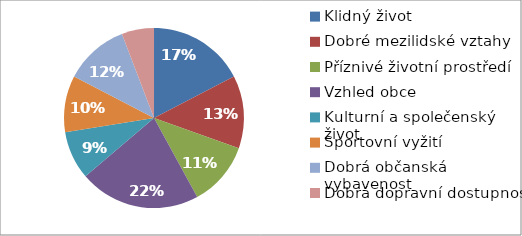
| Category | Series 0 |
|---|---|
| Klidný život | 12 |
| Dobré mezilidské vztahy | 9 |
| Příznivé životní prostředí | 8 |
| Vzhled obce | 15 |
| Kulturní a společenský život | 6 |
| Sportovní vyžití | 7 |
| Dobrá občanská vybavenost | 8 |
| Dobrá dopravní dostupnost | 4 |